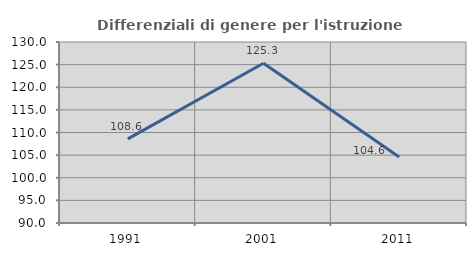
| Category | Differenziali di genere per l'istruzione superiore |
|---|---|
| 1991.0 | 108.595 |
| 2001.0 | 125.293 |
| 2011.0 | 104.581 |